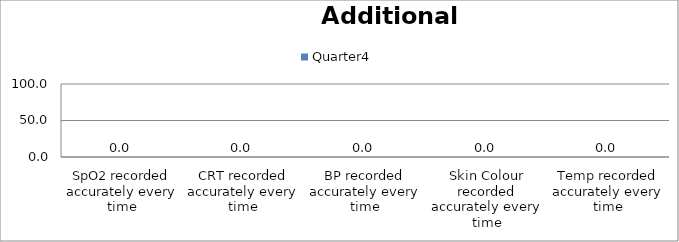
| Category | Quarter4 |
|---|---|
| SpO2 recorded accurately every time | 0 |
| CRT recorded accurately every time | 0 |
| BP recorded accurately every time | 0 |
| Skin Colour recorded accurately every time | 0 |
| Temp recorded accurately every time | 0 |